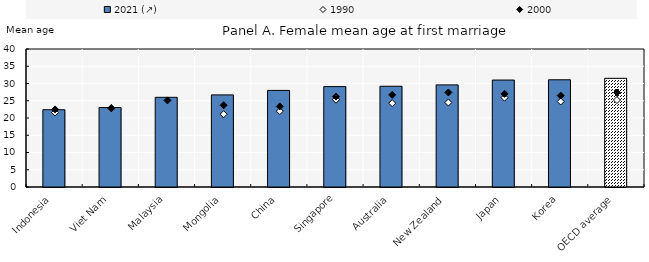
| Category | 2021 (↗) |
|---|---|
| Indonesia | 22.4 |
| Viet Nam | 23.04 |
| Malaysia | 26 |
| Mongolia | 26.7 |
| China | 28 |
| Singapore | 29.1 |
| Australia | 29.2 |
| New Zealand | 29.6 |
| Japan | 31 |
| Korea | 31.08 |
| OECD average | 31.499 |